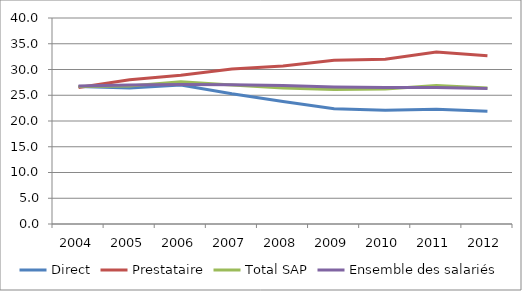
| Category | Direct | Prestataire | Total SAP | Ensemble des salariés |
|---|---|---|---|---|
| 2004.0 | 26.7 | 26.5 | 26.7 | 26.8 |
| 2005.0 | 26.4 | 28 | 26.8 | 27 |
| 2006.0 | 27 | 28.9 | 27.6 | 27.1 |
| 2007.0 | 25.284 | 30.092 | 26.975 | 27.038 |
| 2008.0 | 23.8 | 30.7 | 26.4 | 26.9 |
| 2009.0 | 22.4 | 31.8 | 26.1 | 26.6 |
| 2010.0 | 22.1 | 32 | 26.2 | 26.5 |
| 2011.0 | 22.3 | 33.4 | 26.9 | 26.5 |
| 2012.0 | 21.896 | 32.658 | 26.384 | 26.32 |